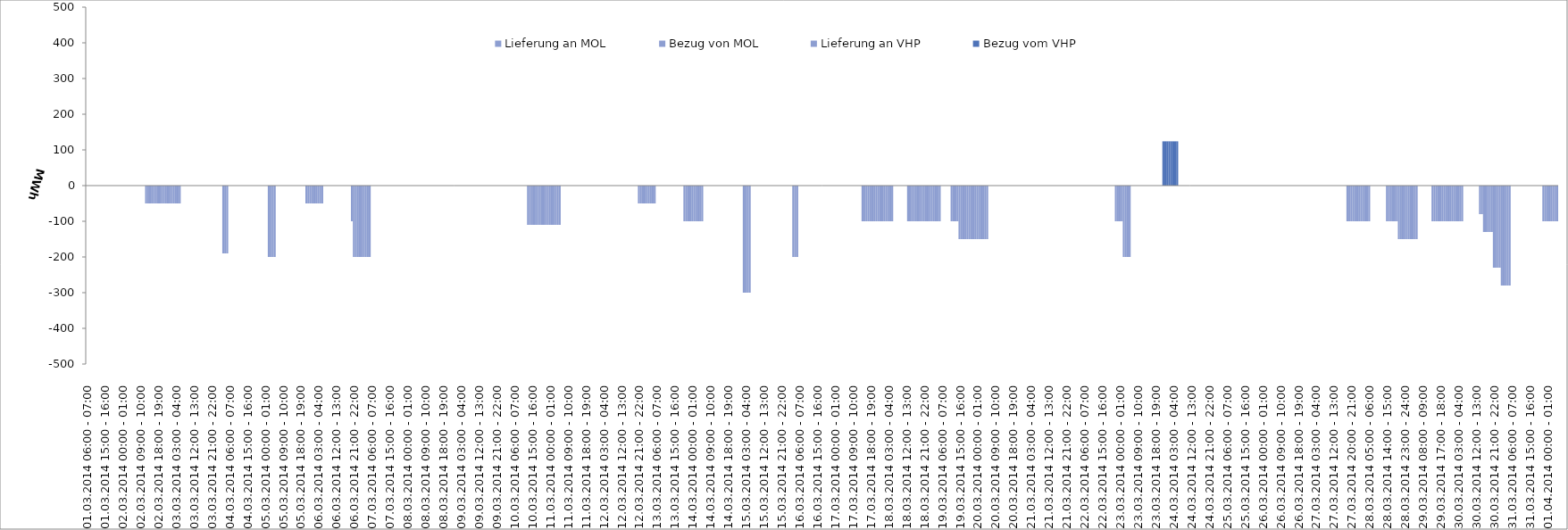
| Category | Bezug vom VHP | Lieferung an VHP | Bezug von MOL | Lieferung an MOL |
|---|---|---|---|---|
| 01.03.2014 06:00 - 07:00 | 0 | 0 | 0 | 0 |
| 01.03.2014 07:00 - 08:00 | 0 | 0 | 0 | 0 |
| 01.03.2014 08:00 - 09:00 | 0 | 0 | 0 | 0 |
| 01.03.2014 09:00 - 10:00 | 0 | 0 | 0 | 0 |
| 01.03.2014 10:00 - 11:00 | 0 | 0 | 0 | 0 |
| 01.03.2014 11:00 - 12:00 | 0 | 0 | 0 | 0 |
| 01.03.2014 12:00 - 13:00 | 0 | 0 | 0 | 0 |
| 01.03.2014 13:00 - 14:00 | 0 | 0 | 0 | 0 |
| 01.03.2014 14:00 - 15:00 | 0 | 0 | 0 | 0 |
| 01.03.2014 15:00 - 16:00 | 0 | 0 | 0 | 0 |
| 01.03.2014 16:00 - 17:00 | 0 | 0 | 0 | 0 |
| 01.03.2014 17:00 - 18:00 | 0 | 0 | 0 | 0 |
| 01.03.2014 18:00 - 19:00 | 0 | 0 | 0 | 0 |
| 01.03.2014 19:00 - 20:00 | 0 | 0 | 0 | 0 |
| 01.03.2014 20:00 - 21:00 | 0 | 0 | 0 | 0 |
| 01.03.2014 21:00 - 22:00 | 0 | 0 | 0 | 0 |
| 01.03.2014 22:00 - 23:00 | 0 | 0 | 0 | 0 |
| 01.03.2014 23:00 - 24:00 | 0 | 0 | 0 | 0 |
| 02.03.2014 00:00 - 01:00 | 0 | 0 | 0 | 0 |
| 02.03.2014 01:00 - 02:00 | 0 | 0 | 0 | 0 |
| 02.03.2014 02:00 - 03:00 | 0 | 0 | 0 | 0 |
| 02.03.2014 03:00 - 04:00 | 0 | 0 | 0 | 0 |
| 02.03.2014 04:00 - 05:00 | 0 | 0 | 0 | 0 |
| 02.03.2014 05:00 - 06:00 | 0 | 0 | 0 | 0 |
| 02.03.2014 06:00 - 07:00 | 0 | 0 | 0 | 0 |
| 02.03.2014 07:00 - 08:00 | 0 | 0 | 0 | 0 |
| 02.03.2014 08:00 - 09:00 | 0 | 0 | 0 | 0 |
| 02.03.2014 09:00 - 10:00 | 0 | 0 | 0 | 0 |
| 02.03.2014 10:00 - 11:00 | 0 | 0 | 0 | 0 |
| 02.03.2014 11:00 - 12:00 | 0 | 0 | 0 | 0 |
| 02.03.2014 12:00 - 13:00 | 0 | -50 | 0 | 0 |
| 02.03.2014 13:00 - 14:00 | 0 | -50 | 0 | 0 |
| 02.03.2014 14:00 - 15:00 | 0 | -50 | 0 | 0 |
| 02.03.2014 15:00 - 16:00 | 0 | -50 | 0 | 0 |
| 02.03.2014 16:00 - 17:00 | 0 | -50 | 0 | 0 |
| 02.03.2014 17:00 - 18:00 | 0 | -50 | 0 | 0 |
| 02.03.2014 18:00 - 19:00 | 0 | -50 | 0 | 0 |
| 02.03.2014 19:00 - 20:00 | 0 | -50 | 0 | 0 |
| 02.03.2014 20:00 - 21:00 | 0 | -50 | 0 | 0 |
| 02.03.2014 21:00 - 22:00 | 0 | -50 | 0 | 0 |
| 02.03.2014 22:00 - 23:00 | 0 | -50 | 0 | 0 |
| 02.03.2014 23:00 - 24:00 | 0 | -50 | 0 | 0 |
| 03.03.2014 00:00 - 01:00 | 0 | -50 | 0 | 0 |
| 03.03.2014 01:00 - 02:00 | 0 | -50 | 0 | 0 |
| 03.03.2014 02:00 - 03:00 | 0 | -50 | 0 | 0 |
| 03.03.2014 03:00 - 04:00 | 0 | -50 | 0 | 0 |
| 03.03.2014 04:00 - 05:00 | 0 | -50 | 0 | 0 |
| 03.03.2014 05:00 - 06:00 | 0 | -50 | 0 | 0 |
| 03.03.2014 06:00 - 07:00 | 0 | 0 | 0 | 0 |
| 03.03.2014 07:00 - 08:00 | 0 | 0 | 0 | 0 |
| 03.03.2014 08:00 - 09:00 | 0 | 0 | 0 | 0 |
| 03.03.2014 09:00 - 10:00 | 0 | 0 | 0 | 0 |
| 03.03.2014 10:00 - 11:00 | 0 | 0 | 0 | 0 |
| 03.03.2014 11:00 - 12:00 | 0 | 0 | 0 | 0 |
| 03.03.2014 12:00 - 13:00 | 0 | 0 | 0 | 0 |
| 03.03.2014 13:00 - 14:00 | 0 | 0 | 0 | 0 |
| 03.03.2014 14:00 - 15:00 | 0 | 0 | 0 | 0 |
| 03.03.2014 15:00 - 16:00 | 0 | 0 | 0 | 0 |
| 03.03.2014 16:00 - 17:00 | 0 | 0 | 0 | 0 |
| 03.03.2014 17:00 - 18:00 | 0 | 0 | 0 | 0 |
| 03.03.2014 18:00 - 19:00 | 0 | 0 | 0 | 0 |
| 03.03.2014 19:00 - 20:00 | 0 | 0 | 0 | 0 |
| 03.03.2014 20:00 - 21:00 | 0 | 0 | 0 | 0 |
| 03.03.2014 21:00 - 22:00 | 0 | 0 | 0 | 0 |
| 03.03.2014 22:00 - 23:00 | 0 | 0 | 0 | 0 |
| 03.03.2014 23:00 - 24:00 | 0 | 0 | 0 | 0 |
| 04.03.2014 00:00 - 01:00 | 0 | 0 | 0 | 0 |
| 04.03.2014 01:00 - 02:00 | 0 | 0 | 0 | 0 |
| 04.03.2014 02:00 - 03:00 | 0 | 0 | 0 | 0 |
| 04.03.2014 03:00 - 04:00 | 0 | -190 | 0 | 0 |
| 04.03.2014 04:00 - 05:00 | 0 | -190 | 0 | 0 |
| 04.03.2014 05:00 - 06:00 | 0 | -190 | 0 | 0 |
| 04.03.2014 06:00 - 07:00 | 0 | 0 | 0 | 0 |
| 04.03.2014 07:00 - 08:00 | 0 | 0 | 0 | 0 |
| 04.03.2014 08:00 - 09:00 | 0 | 0 | 0 | 0 |
| 04.03.2014 09:00 - 10:00 | 0 | 0 | 0 | 0 |
| 04.03.2014 10:00 - 11:00 | 0 | 0 | 0 | 0 |
| 04.03.2014 11:00 - 12:00 | 0 | 0 | 0 | 0 |
| 04.03.2014 12:00 - 13:00 | 0 | 0 | 0 | 0 |
| 04.03.2014 13:00 - 14:00 | 0 | 0 | 0 | 0 |
| 04.03.2014 14:00 - 15:00 | 0 | 0 | 0 | 0 |
| 04.03.2014 15:00 - 16:00 | 0 | 0 | 0 | 0 |
| 04.03.2014 16:00 - 17:00 | 0 | 0 | 0 | 0 |
| 04.03.2014 17:00 - 18:00 | 0 | 0 | 0 | 0 |
| 04.03.2014 18:00 - 19:00 | 0 | 0 | 0 | 0 |
| 04.03.2014 19:00 - 20:00 | 0 | 0 | 0 | 0 |
| 04.03.2014 20:00 - 21:00 | 0 | 0 | 0 | 0 |
| 04.03.2014 21:00 - 22:00 | 0 | 0 | 0 | 0 |
| 04.03.2014 22:00 - 23:00 | 0 | 0 | 0 | 0 |
| 04.03.2014 23:00 - 24:00 | 0 | 0 | 0 | 0 |
| 05.03.2014 00:00 - 01:00 | 0 | 0 | 0 | 0 |
| 05.03.2014 01:00 - 02:00 | 0 | 0 | 0 | 0 |
| 05.03.2014 02:00 - 03:00 | 0 | -200 | 0 | 0 |
| 05.03.2014 03:00 - 04:00 | 0 | -200 | 0 | 0 |
| 05.03.2014 04:00 - 05:00 | 0 | -200 | 0 | 0 |
| 05.03.2014 05:00 - 06:00 | 0 | -200 | 0 | 0 |
| 05.03.2014 06:00 - 07:00 | 0 | 0 | 0 | 0 |
| 05.03.2014 07:00 - 08:00 | 0 | 0 | 0 | 0 |
| 05.03.2014 08:00 - 09:00 | 0 | 0 | 0 | 0 |
| 05.03.2014 09:00 - 10:00 | 0 | 0 | 0 | 0 |
| 05.03.2014 10:00 - 11:00 | 0 | 0 | 0 | 0 |
| 05.03.2014 11:00 - 12:00 | 0 | 0 | 0 | 0 |
| 05.03.2014 12:00 - 13:00 | 0 | 0 | 0 | 0 |
| 05.03.2014 13:00 - 14:00 | 0 | 0 | 0 | 0 |
| 05.03.2014 14:00 - 15:00 | 0 | 0 | 0 | 0 |
| 05.03.2014 15:00 - 16:00 | 0 | 0 | 0 | 0 |
| 05.03.2014 16:00 - 17:00 | 0 | 0 | 0 | 0 |
| 05.03.2014 17:00 - 18:00 | 0 | 0 | 0 | 0 |
| 05.03.2014 18:00 - 19:00 | 0 | 0 | 0 | 0 |
| 05.03.2014 19:00 - 20:00 | 0 | 0 | 0 | 0 |
| 05.03.2014 20:00 - 21:00 | 0 | 0 | 0 | 0 |
| 05.03.2014 21:00 - 22:00 | 0 | -50 | 0 | 0 |
| 05.03.2014 22:00 - 23:00 | 0 | -50 | 0 | 0 |
| 05.03.2014 23:00 - 24:00 | 0 | -50 | 0 | 0 |
| 06.03.2014 00:00 - 01:00 | 0 | -50 | 0 | 0 |
| 06.03.2014 01:00 - 02:00 | 0 | -50 | 0 | 0 |
| 06.03.2014 02:00 - 03:00 | 0 | -50 | 0 | 0 |
| 06.03.2014 03:00 - 04:00 | 0 | -50 | 0 | 0 |
| 06.03.2014 04:00 - 05:00 | 0 | -50 | 0 | 0 |
| 06.03.2014 05:00 - 06:00 | 0 | -50 | 0 | 0 |
| 06.03.2014 06:00 - 07:00 | 0 | 0 | 0 | 0 |
| 06.03.2014 07:00 - 08:00 | 0 | 0 | 0 | 0 |
| 06.03.2014 08:00 - 09:00 | 0 | 0 | 0 | 0 |
| 06.03.2014 09:00 - 10:00 | 0 | 0 | 0 | 0 |
| 06.03.2014 10:00 - 11:00 | 0 | 0 | 0 | 0 |
| 06.03.2014 11:00 - 12:00 | 0 | 0 | 0 | 0 |
| 06.03.2014 12:00 - 13:00 | 0 | 0 | 0 | 0 |
| 06.03.2014 13:00 - 14:00 | 0 | 0 | 0 | 0 |
| 06.03.2014 14:00 - 15:00 | 0 | 0 | 0 | 0 |
| 06.03.2014 15:00 - 16:00 | 0 | 0 | 0 | 0 |
| 06.03.2014 16:00 - 17:00 | 0 | 0 | 0 | 0 |
| 06.03.2014 17:00 - 18:00 | 0 | 0 | 0 | 0 |
| 06.03.2014 18:00 - 19:00 | 0 | 0 | 0 | 0 |
| 06.03.2014 19:00 - 20:00 | 0 | 0 | 0 | 0 |
| 06.03.2014 20:00 - 21:00 | 0 | -100 | 0 | 0 |
| 06.03.2014 21:00 - 22:00 | 0 | -200 | 0 | 0 |
| 06.03.2014 22:00 - 23:00 | 0 | -200 | 0 | 0 |
| 06.03.2014 23:00 - 24:00 | 0 | -200 | 0 | 0 |
| 07.03.2014 00:00 - 01:00 | 0 | -200 | 0 | 0 |
| 07.03.2014 01:00 - 02:00 | 0 | -200 | 0 | 0 |
| 07.03.2014 02:00 - 03:00 | 0 | -200 | 0 | 0 |
| 07.03.2014 03:00 - 04:00 | 0 | -200 | 0 | 0 |
| 07.03.2014 04:00 - 05:00 | 0 | -200 | 0 | 0 |
| 07.03.2014 05:00 - 06:00 | 0 | -200 | 0 | 0 |
| 07.03.2014 06:00 - 07:00 | 0 | 0 | 0 | 0 |
| 07.03.2014 07:00 - 08:00 | 0 | 0 | 0 | 0 |
| 07.03.2014 08:00 - 09:00 | 0 | 0 | 0 | 0 |
| 07.03.2014 09:00 - 10:00 | 0 | 0 | 0 | 0 |
| 07.03.2014 10:00 - 11:00 | 0 | 0 | 0 | 0 |
| 07.03.2014 11:00 - 12:00 | 0 | 0 | 0 | 0 |
| 07.03.2014 12:00 - 13:00 | 0 | 0 | 0 | 0 |
| 07.03.2014 13:00 - 14:00 | 0 | 0 | 0 | 0 |
| 07.03.2014 14:00 - 15:00 | 0 | 0 | 0 | 0 |
| 07.03.2014 15:00 - 16:00 | 0 | 0 | 0 | 0 |
| 07.03.2014 16:00 - 17:00 | 0 | 0 | 0 | 0 |
| 07.03.2014 17:00 - 18:00 | 0 | 0 | 0 | 0 |
| 07.03.2014 18:00 - 19:00 | 0 | 0 | 0 | 0 |
| 07.03.2014 19:00 - 20:00 | 0 | 0 | 0 | 0 |
| 07.03.2014 20:00 - 21:00 | 0 | 0 | 0 | 0 |
| 07.03.2014 21:00 - 22:00 | 0 | 0 | 0 | 0 |
| 07.03.2014 22:00 - 23:00 | 0 | 0 | 0 | 0 |
| 07.03.2014 23:00 - 24:00 | 0 | 0 | 0 | 0 |
| 08.03.2014 00:00 - 01:00 | 0 | 0 | 0 | 0 |
| 08.03.2014 01:00 - 02:00 | 0 | 0 | 0 | 0 |
| 08.03.2014 02:00 - 03:00 | 0 | 0 | 0 | 0 |
| 08.03.2014 03:00 - 04:00 | 0 | 0 | 0 | 0 |
| 08.03.2014 04:00 - 05:00 | 0 | 0 | 0 | 0 |
| 08.03.2014 05:00 - 06:00 | 0 | 0 | 0 | 0 |
| 08.03.2014 06:00 - 07:00 | 0 | 0 | 0 | 0 |
| 08.03.2014 07:00 - 08:00 | 0 | 0 | 0 | 0 |
| 08.03.2014 08:00 - 09:00 | 0 | 0 | 0 | 0 |
| 08.03.2014 09:00 - 10:00 | 0 | 0 | 0 | 0 |
| 08.03.2014 10:00 - 11:00 | 0 | 0 | 0 | 0 |
| 08.03.2014 11:00 - 12:00 | 0 | 0 | 0 | 0 |
| 08.03.2014 12:00 - 13:00 | 0 | 0 | 0 | 0 |
| 08.03.2014 13:00 - 14:00 | 0 | 0 | 0 | 0 |
| 08.03.2014 14:00 - 15:00 | 0 | 0 | 0 | 0 |
| 08.03.2014 15:00 - 16:00 | 0 | 0 | 0 | 0 |
| 08.03.2014 16:00 - 17:00 | 0 | 0 | 0 | 0 |
| 08.03.2014 17:00 - 18:00 | 0 | 0 | 0 | 0 |
| 08.03.2014 18:00 - 19:00 | 0 | 0 | 0 | 0 |
| 08.03.2014 19:00 - 20:00 | 0 | 0 | 0 | 0 |
| 08.03.2014 20:00 - 21:00 | 0 | 0 | 0 | 0 |
| 08.03.2014 21:00 - 22:00 | 0 | 0 | 0 | 0 |
| 08.03.2014 22:00 - 23:00 | 0 | 0 | 0 | 0 |
| 08.03.2014 23:00 - 24:00 | 0 | 0 | 0 | 0 |
| 09.03.2014 00:00 - 01:00 | 0 | 0 | 0 | 0 |
| 09.03.2014 01:00 - 02:00 | 0 | 0 | 0 | 0 |
| 09.03.2014 02:00 - 03:00 | 0 | 0 | 0 | 0 |
| 09.03.2014 03:00 - 04:00 | 0 | 0 | 0 | 0 |
| 09.03.2014 04:00 - 05:00 | 0 | 0 | 0 | 0 |
| 09.03.2014 05:00 - 06:00 | 0 | 0 | 0 | 0 |
| 09.03.2014 06:00 - 07:00 | 0 | 0 | 0 | 0 |
| 09.03.2014 07:00 - 08:00 | 0 | 0 | 0 | 0 |
| 09.03.2014 08:00 - 09:00 | 0 | 0 | 0 | 0 |
| 09.03.2014 09:00 - 10:00 | 0 | 0 | 0 | 0 |
| 09.03.2014 10:00 - 11:00 | 0 | 0 | 0 | 0 |
| 09.03.2014 11:00 - 12:00 | 0 | 0 | 0 | 0 |
| 09.03.2014 12:00 - 13:00 | 0 | 0 | 0 | 0 |
| 09.03.2014 13:00 - 14:00 | 0 | 0 | 0 | 0 |
| 09.03.2014 14:00 - 15:00 | 0 | 0 | 0 | 0 |
| 09.03.2014 15:00 - 16:00 | 0 | 0 | 0 | 0 |
| 09.03.2014 16:00 - 17:00 | 0 | 0 | 0 | 0 |
| 09.03.2014 17:00 - 18:00 | 0 | 0 | 0 | 0 |
| 09.03.2014 18:00 - 19:00 | 0 | 0 | 0 | 0 |
| 09.03.2014 19:00 - 20:00 | 0 | 0 | 0 | 0 |
| 09.03.2014 20:00 - 21:00 | 0 | 0 | 0 | 0 |
| 09.03.2014 21:00 - 22:00 | 0 | 0 | 0 | 0 |
| 09.03.2014 22:00 - 23:00 | 0 | 0 | 0 | 0 |
| 09.03.2014 23:00 - 24:00 | 0 | 0 | 0 | 0 |
| 10.03.2014 00:00 - 01:00 | 0 | 0 | 0 | 0 |
| 10.03.2014 01:00 - 02:00 | 0 | 0 | 0 | 0 |
| 10.03.2014 02:00 - 03:00 | 0 | 0 | 0 | 0 |
| 10.03.2014 03:00 - 04:00 | 0 | 0 | 0 | 0 |
| 10.03.2014 04:00 - 05:00 | 0 | 0 | 0 | 0 |
| 10.03.2014 05:00 - 06:00 | 0 | 0 | 0 | 0 |
| 10.03.2014 06:00 - 07:00 | 0 | 0 | 0 | 0 |
| 10.03.2014 07:00 - 08:00 | 0 | 0 | 0 | 0 |
| 10.03.2014 08:00 - 09:00 | 0 | 0 | 0 | 0 |
| 10.03.2014 09:00 - 10:00 | 0 | 0 | 0 | 0 |
| 10.03.2014 10:00 - 11:00 | 0 | 0 | 0 | 0 |
| 10.03.2014 11:00 - 12:00 | 0 | 0 | 0 | 0 |
| 10.03.2014 12:00 - 13:00 | 0 | 0 | 0 | 0 |
| 10.03.2014 13:00 - 14:00 | 0 | -110 | 0 | 0 |
| 10.03.2014 14:00 - 15:00 | 0 | -110 | 0 | 0 |
| 10.03.2014 15:00 - 16:00 | 0 | -110 | 0 | 0 |
| 10.03.2014 16:00 - 17:00 | 0 | -110 | 0 | 0 |
| 10.03.2014 17:00 - 18:00 | 0 | -110 | 0 | 0 |
| 10.03.2014 18:00 - 19:00 | 0 | -110 | 0 | 0 |
| 10.03.2014 19:00 - 20:00 | 0 | -110 | 0 | 0 |
| 10.03.2014 20:00 - 21:00 | 0 | -110 | 0 | 0 |
| 10.03.2014 21:00 - 22:00 | 0 | -110 | 0 | 0 |
| 10.03.2014 22:00 - 23:00 | 0 | -110 | 0 | 0 |
| 10.03.2014 23:00 - 24:00 | 0 | -110 | 0 | 0 |
| 11.03.2014 00:00 - 01:00 | 0 | -110 | 0 | 0 |
| 11.03.2014 01:00 - 02:00 | 0 | -110 | 0 | 0 |
| 11.03.2014 02:00 - 03:00 | 0 | -110 | 0 | 0 |
| 11.03.2014 03:00 - 04:00 | 0 | -110 | 0 | 0 |
| 11.03.2014 04:00 - 05:00 | 0 | -110 | 0 | 0 |
| 11.03.2014 05:00 - 06:00 | 0 | -110 | 0 | 0 |
| 11.03.2014 06:00 - 07:00 | 0 | 0 | 0 | 0 |
| 11.03.2014 07:00 - 08:00 | 0 | 0 | 0 | 0 |
| 11.03.2014 08:00 - 09:00 | 0 | 0 | 0 | 0 |
| 11.03.2014 09:00 - 10:00 | 0 | 0 | 0 | 0 |
| 11.03.2014 10:00 - 11:00 | 0 | 0 | 0 | 0 |
| 11.03.2014 11:00 - 12:00 | 0 | 0 | 0 | 0 |
| 11.03.2014 12:00 - 13:00 | 0 | 0 | 0 | 0 |
| 11.03.2014 13:00 - 14:00 | 0 | 0 | 0 | 0 |
| 11.03.2014 14:00 - 15:00 | 0 | 0 | 0 | 0 |
| 11.03.2014 15:00 - 16:00 | 0 | 0 | 0 | 0 |
| 11.03.2014 16:00 - 17:00 | 0 | 0 | 0 | 0 |
| 11.03.2014 17:00 - 18:00 | 0 | 0 | 0 | 0 |
| 11.03.2014 18:00 - 19:00 | 0 | 0 | 0 | 0 |
| 11.03.2014 19:00 - 20:00 | 0 | 0 | 0 | 0 |
| 11.03.2014 20:00 - 21:00 | 0 | 0 | 0 | 0 |
| 11.03.2014 21:00 - 22:00 | 0 | 0 | 0 | 0 |
| 11.03.2014 22:00 - 23:00 | 0 | 0 | 0 | 0 |
| 11.03.2014 23:00 - 24:00 | 0 | 0 | 0 | 0 |
| 12.03.2014 00:00 - 01:00 | 0 | 0 | 0 | 0 |
| 12.03.2014 01:00 - 02:00 | 0 | 0 | 0 | 0 |
| 12.03.2014 02:00 - 03:00 | 0 | 0 | 0 | 0 |
| 12.03.2014 03:00 - 04:00 | 0 | 0 | 0 | 0 |
| 12.03.2014 04:00 - 05:00 | 0 | 0 | 0 | 0 |
| 12.03.2014 05:00 - 06:00 | 0 | 0 | 0 | 0 |
| 12.03.2014 06:00 - 07:00 | 0 | 0 | 0 | 0 |
| 12.03.2014 07:00 - 08:00 | 0 | 0 | 0 | 0 |
| 12.03.2014 08:00 - 09:00 | 0 | 0 | 0 | 0 |
| 12.03.2014 09:00 - 10:00 | 0 | 0 | 0 | 0 |
| 12.03.2014 10:00 - 11:00 | 0 | 0 | 0 | 0 |
| 12.03.2014 11:00 - 12:00 | 0 | 0 | 0 | 0 |
| 12.03.2014 12:00 - 13:00 | 0 | 0 | 0 | 0 |
| 12.03.2014 13:00 - 14:00 | 0 | 0 | 0 | 0 |
| 12.03.2014 14:00 - 15:00 | 0 | 0 | 0 | 0 |
| 12.03.2014 15:00 - 16:00 | 0 | 0 | 0 | 0 |
| 12.03.2014 16:00 - 17:00 | 0 | 0 | 0 | 0 |
| 12.03.2014 17:00 - 18:00 | 0 | 0 | 0 | 0 |
| 12.03.2014 18:00 - 19:00 | 0 | 0 | 0 | 0 |
| 12.03.2014 19:00 - 20:00 | 0 | 0 | 0 | 0 |
| 12.03.2014 20:00 - 21:00 | 0 | 0 | 0 | 0 |
| 12.03.2014 21:00 - 22:00 | 0 | -50 | 0 | 0 |
| 12.03.2014 22:00 - 23:00 | 0 | -50 | 0 | 0 |
| 12.03.2014 23:00 - 24:00 | 0 | -50 | 0 | 0 |
| 13.03.2014 00:00 - 01:00 | 0 | -50 | 0 | 0 |
| 13.03.2014 01:00 - 02:00 | 0 | -50 | 0 | 0 |
| 13.03.2014 02:00 - 03:00 | 0 | -50 | 0 | 0 |
| 13.03.2014 03:00 - 04:00 | 0 | -50 | 0 | 0 |
| 13.03.2014 04:00 - 05:00 | 0 | -50 | 0 | 0 |
| 13.03.2014 05:00 - 06:00 | 0 | -50 | 0 | 0 |
| 13.03.2014 06:00 - 07:00 | 0 | 0 | 0 | 0 |
| 13.03.2014 07:00 - 08:00 | 0 | 0 | 0 | 0 |
| 13.03.2014 08:00 - 09:00 | 0 | 0 | 0 | 0 |
| 13.03.2014 09:00 - 10:00 | 0 | 0 | 0 | 0 |
| 13.03.2014 10:00 - 11:00 | 0 | 0 | 0 | 0 |
| 13.03.2014 11:00 - 12:00 | 0 | 0 | 0 | 0 |
| 13.03.2014 12:00 - 13:00 | 0 | 0 | 0 | 0 |
| 13.03.2014 13:00 - 14:00 | 0 | 0 | 0 | 0 |
| 13.03.2014 14:00 - 15:00 | 0 | 0 | 0 | 0 |
| 13.03.2014 15:00 - 16:00 | 0 | 0 | 0 | 0 |
| 13.03.2014 16:00 - 17:00 | 0 | 0 | 0 | 0 |
| 13.03.2014 17:00 - 18:00 | 0 | 0 | 0 | 0 |
| 13.03.2014 18:00 - 19:00 | 0 | 0 | 0 | 0 |
| 13.03.2014 19:00 - 20:00 | 0 | 0 | 0 | 0 |
| 13.03.2014 20:00 - 21:00 | 0 | -100 | 0 | 0 |
| 13.03.2014 21:00 - 22:00 | 0 | -100 | 0 | 0 |
| 13.03.2014 22:00 - 23:00 | 0 | -100 | 0 | 0 |
| 13.03.2014 23:00 - 24:00 | 0 | -100 | 0 | 0 |
| 14.03.2014 00:00 - 01:00 | 0 | -100 | 0 | 0 |
| 14.03.2014 01:00 - 02:00 | 0 | -100 | 0 | 0 |
| 14.03.2014 02:00 - 03:00 | 0 | -100 | 0 | 0 |
| 14.03.2014 03:00 - 04:00 | 0 | -100 | 0 | 0 |
| 14.03.2014 04:00 - 05:00 | 0 | -100 | 0 | 0 |
| 14.03.2014 05:00 - 06:00 | 0 | -100 | 0 | 0 |
| 14.03.2014 06:00 - 07:00 | 0 | 0 | 0 | 0 |
| 14.03.2014 07:00 - 08:00 | 0 | 0 | 0 | 0 |
| 14.03.2014 08:00 - 09:00 | 0 | 0 | 0 | 0 |
| 14.03.2014 09:00 - 10:00 | 0 | 0 | 0 | 0 |
| 14.03.2014 10:00 - 11:00 | 0 | 0 | 0 | 0 |
| 14.03.2014 11:00 - 12:00 | 0 | 0 | 0 | 0 |
| 14.03.2014 12:00 - 13:00 | 0 | 0 | 0 | 0 |
| 14.03.2014 13:00 - 14:00 | 0 | 0 | 0 | 0 |
| 14.03.2014 14:00 - 15:00 | 0 | 0 | 0 | 0 |
| 14.03.2014 15:00 - 16:00 | 0 | 0 | 0 | 0 |
| 14.03.2014 16:00 - 17:00 | 0 | 0 | 0 | 0 |
| 14.03.2014 17:00 - 18:00 | 0 | 0 | 0 | 0 |
| 14.03.2014 18:00 - 19:00 | 0 | 0 | 0 | 0 |
| 14.03.2014 19:00 - 20:00 | 0 | 0 | 0 | 0 |
| 14.03.2014 20:00 - 21:00 | 0 | 0 | 0 | 0 |
| 14.03.2014 21:00 - 22:00 | 0 | 0 | 0 | 0 |
| 14.03.2014 22:00 - 23:00 | 0 | 0 | 0 | 0 |
| 14.03.2014 23:00 - 24:00 | 0 | 0 | 0 | 0 |
| 15.03.2014 00:00 - 01:00 | 0 | 0 | 0 | 0 |
| 15.03.2014 01:00 - 02:00 | 0 | 0 | 0 | 0 |
| 15.03.2014 02:00 - 03:00 | 0 | -300 | 0 | 0 |
| 15.03.2014 03:00 - 04:00 | 0 | -300 | 0 | 0 |
| 15.03.2014 04:00 - 05:00 | 0 | -300 | 0 | 0 |
| 15.03.2014 05:00 - 06:00 | 0 | -300 | 0 | 0 |
| 15.03.2014 06:00 - 07:00 | 0 | 0 | 0 | 0 |
| 15.03.2014 07:00 - 08:00 | 0 | 0 | 0 | 0 |
| 15.03.2014 08:00 - 09:00 | 0 | 0 | 0 | 0 |
| 15.03.2014 09:00 - 10:00 | 0 | 0 | 0 | 0 |
| 15.03.2014 10:00 - 11:00 | 0 | 0 | 0 | 0 |
| 15.03.2014 11:00 - 12:00 | 0 | 0 | 0 | 0 |
| 15.03.2014 12:00 - 13:00 | 0 | 0 | 0 | 0 |
| 15.03.2014 13:00 - 14:00 | 0 | 0 | 0 | 0 |
| 15.03.2014 14:00 - 15:00 | 0 | 0 | 0 | 0 |
| 15.03.2014 15:00 - 16:00 | 0 | 0 | 0 | 0 |
| 15.03.2014 16:00 - 17:00 | 0 | 0 | 0 | 0 |
| 15.03.2014 17:00 - 18:00 | 0 | 0 | 0 | 0 |
| 15.03.2014 18:00 - 19:00 | 0 | 0 | 0 | 0 |
| 15.03.2014 19:00 - 20:00 | 0 | 0 | 0 | 0 |
| 15.03.2014 20:00 - 21:00 | 0 | 0 | 0 | 0 |
| 15.03.2014 21:00 - 22:00 | 0 | 0 | 0 | 0 |
| 15.03.2014 22:00 - 23:00 | 0 | 0 | 0 | 0 |
| 15.03.2014 23:00 - 24:00 | 0 | 0 | 0 | 0 |
| 16.03.2014 00:00 - 01:00 | 0 | 0 | 0 | 0 |
| 16.03.2014 01:00 - 02:00 | 0 | 0 | 0 | 0 |
| 16.03.2014 02:00 - 03:00 | 0 | 0 | 0 | 0 |
| 16.03.2014 03:00 - 04:00 | 0 | -200 | 0 | 0 |
| 16.03.2014 04:00 - 05:00 | 0 | -200 | 0 | 0 |
| 16.03.2014 05:00 - 06:00 | 0 | -200 | 0 | 0 |
| 16.03.2014 06:00 - 07:00 | 0 | 0 | 0 | 0 |
| 16.03.2014 07:00 - 08:00 | 0 | 0 | 0 | 0 |
| 16.03.2014 08:00 - 09:00 | 0 | 0 | 0 | 0 |
| 16.03.2014 09:00 - 10:00 | 0 | 0 | 0 | 0 |
| 16.03.2014 10:00 - 11:00 | 0 | 0 | 0 | 0 |
| 16.03.2014 11:00 - 12:00 | 0 | 0 | 0 | 0 |
| 16.03.2014 12:00 - 13:00 | 0 | 0 | 0 | 0 |
| 16.03.2014 13:00 - 14:00 | 0 | 0 | 0 | 0 |
| 16.03.2014 14:00 - 15:00 | 0 | 0 | 0 | 0 |
| 16.03.2014 15:00 - 16:00 | 0 | 0 | 0 | 0 |
| 16.03.2014 16:00 - 17:00 | 0 | 0 | 0 | 0 |
| 16.03.2014 17:00 - 18:00 | 0 | 0 | 0 | 0 |
| 16.03.2014 18:00 - 19:00 | 0 | 0 | 0 | 0 |
| 16.03.2014 19:00 - 20:00 | 0 | 0 | 0 | 0 |
| 16.03.2014 20:00 - 21:00 | 0 | 0 | 0 | 0 |
| 16.03.2014 21:00 - 22:00 | 0 | 0 | 0 | 0 |
| 16.03.2014 22:00 - 23:00 | 0 | 0 | 0 | 0 |
| 16.03.2014 23:00 - 24:00 | 0 | 0 | 0 | 0 |
| 17.03.2014 00:00 - 01:00 | 0 | 0 | 0 | 0 |
| 17.03.2014 01:00 - 02:00 | 0 | 0 | 0 | 0 |
| 17.03.2014 02:00 - 03:00 | 0 | 0 | 0 | 0 |
| 17.03.2014 03:00 - 04:00 | 0 | 0 | 0 | 0 |
| 17.03.2014 04:00 - 05:00 | 0 | 0 | 0 | 0 |
| 17.03.2014 05:00 - 06:00 | 0 | 0 | 0 | 0 |
| 17.03.2014 06:00 - 07:00 | 0 | 0 | 0 | 0 |
| 17.03.2014 07:00 - 08:00 | 0 | 0 | 0 | 0 |
| 17.03.2014 08:00 - 09:00 | 0 | 0 | 0 | 0 |
| 17.03.2014 09:00 - 10:00 | 0 | 0 | 0 | 0 |
| 17.03.2014 10:00 - 11:00 | 0 | 0 | 0 | 0 |
| 17.03.2014 11:00 - 12:00 | 0 | 0 | 0 | 0 |
| 17.03.2014 12:00 - 13:00 | 0 | 0 | 0 | 0 |
| 17.03.2014 13:00 - 14:00 | 0 | 0 | 0 | 0 |
| 17.03.2014 14:00 - 15:00 | 0 | -100 | 0 | 0 |
| 17.03.2014 15:00 - 16:00 | 0 | -100 | 0 | 0 |
| 17.03.2014 16:00 - 17:00 | 0 | -100 | 0 | 0 |
| 17.03.2014 17:00 - 18:00 | 0 | -100 | 0 | 0 |
| 17.03.2014 18:00 - 19:00 | 0 | -100 | 0 | 0 |
| 17.03.2014 19:00 - 20:00 | 0 | -100 | 0 | 0 |
| 17.03.2014 20:00 - 21:00 | 0 | -100 | 0 | 0 |
| 17.03.2014 21:00 - 22:00 | 0 | -100 | 0 | 0 |
| 17.03.2014 22:00 - 23:00 | 0 | -100 | 0 | 0 |
| 17.03.2014 23:00 - 24:00 | 0 | -100 | 0 | 0 |
| 18.03.2014 00:00 - 01:00 | 0 | -100 | 0 | 0 |
| 18.03.2014 01:00 - 02:00 | 0 | -100 | 0 | 0 |
| 18.03.2014 02:00 - 03:00 | 0 | -100 | 0 | 0 |
| 18.03.2014 03:00 - 04:00 | 0 | -100 | 0 | 0 |
| 18.03.2014 04:00 - 05:00 | 0 | -100 | 0 | 0 |
| 18.03.2014 05:00 - 06:00 | 0 | -100 | 0 | 0 |
| 18.03.2014 06:00 - 07:00 | 0 | 0 | 0 | 0 |
| 18.03.2014 07:00 - 08:00 | 0 | 0 | 0 | 0 |
| 18.03.2014 08:00 - 09:00 | 0 | 0 | 0 | 0 |
| 18.03.2014 09:00 - 10:00 | 0 | 0 | 0 | 0 |
| 18.03.2014 10:00 - 11:00 | 0 | 0 | 0 | 0 |
| 18.03.2014 11:00 - 12:00 | 0 | 0 | 0 | 0 |
| 18.03.2014 12:00 - 13:00 | 0 | 0 | 0 | 0 |
| 18.03.2014 13:00 - 14:00 | 0 | -100 | 0 | 0 |
| 18.03.2014 14:00 - 15:00 | 0 | -100 | 0 | 0 |
| 18.03.2014 15:00 - 16:00 | 0 | -100 | 0 | 0 |
| 18.03.2014 16:00 - 17:00 | 0 | -100 | 0 | 0 |
| 18.03.2014 17:00 - 18:00 | 0 | -100 | 0 | 0 |
| 18.03.2014 18:00 - 19:00 | 0 | -100 | 0 | 0 |
| 18.03.2014 19:00 - 20:00 | 0 | -100 | 0 | 0 |
| 18.03.2014 20:00 - 21:00 | 0 | -100 | 0 | 0 |
| 18.03.2014 21:00 - 22:00 | 0 | -100 | 0 | 0 |
| 18.03.2014 22:00 - 23:00 | 0 | -100 | 0 | 0 |
| 18.03.2014 23:00 - 24:00 | 0 | -100 | 0 | 0 |
| 19.03.2014 00:00 - 01:00 | 0 | -100 | 0 | 0 |
| 19.03.2014 01:00 - 02:00 | 0 | -100 | 0 | 0 |
| 19.03.2014 02:00 - 03:00 | 0 | -100 | 0 | 0 |
| 19.03.2014 03:00 - 04:00 | 0 | -100 | 0 | 0 |
| 19.03.2014 04:00 - 05:00 | 0 | -100 | 0 | 0 |
| 19.03.2014 05:00 - 06:00 | 0 | -100 | 0 | 0 |
| 19.03.2014 06:00 - 07:00 | 0 | 0 | 0 | 0 |
| 19.03.2014 07:00 - 08:00 | 0 | 0 | 0 | 0 |
| 19.03.2014 08:00 - 09:00 | 0 | 0 | 0 | 0 |
| 19.03.2014 09:00 - 10:00 | 0 | 0 | 0 | 0 |
| 19.03.2014 10:00 - 11:00 | 0 | 0 | 0 | 0 |
| 19.03.2014 11:00 - 12:00 | 0 | -100 | 0 | 0 |
| 19.03.2014 12:00 - 13:00 | 0 | -100 | 0 | 0 |
| 19.03.2014 13:00 - 14:00 | 0 | -100 | 0 | 0 |
| 19.03.2014 14:00 - 15:00 | 0 | -100 | 0 | 0 |
| 19.03.2014 15:00 - 16:00 | 0 | -150 | 0 | 0 |
| 19.03.2014 16:00 - 17:00 | 0 | -150 | 0 | 0 |
| 19.03.2014 17:00 - 18:00 | 0 | -150 | 0 | 0 |
| 19.03.2014 18:00 - 19:00 | 0 | -150 | 0 | 0 |
| 19.03.2014 19:00 - 20:00 | 0 | -150 | 0 | 0 |
| 19.03.2014 20:00 - 21:00 | 0 | -150 | 0 | 0 |
| 19.03.2014 21:00 - 22:00 | 0 | -150 | 0 | 0 |
| 19.03.2014 22:00 - 23:00 | 0 | -150 | 0 | 0 |
| 19.03.2014 23:00 - 24:00 | 0 | -150 | 0 | 0 |
| 20.03.2014 00:00 - 01:00 | 0 | -150 | 0 | 0 |
| 20.03.2014 01:00 - 02:00 | 0 | -150 | 0 | 0 |
| 20.03.2014 02:00 - 03:00 | 0 | -150 | 0 | 0 |
| 20.03.2014 03:00 - 04:00 | 0 | -150 | 0 | 0 |
| 20.03.2014 04:00 - 05:00 | 0 | -150 | 0 | 0 |
| 20.03.2014 05:00 - 06:00 | 0 | -150 | 0 | 0 |
| 20.03.2014 06:00 - 07:00 | 0 | 0 | 0 | 0 |
| 20.03.2014 07:00 - 08:00 | 0 | 0 | 0 | 0 |
| 20.03.2014 08:00 - 09:00 | 0 | 0 | 0 | 0 |
| 20.03.2014 09:00 - 10:00 | 0 | 0 | 0 | 0 |
| 20.03.2014 10:00 - 11:00 | 0 | 0 | 0 | 0 |
| 20.03.2014 11:00 - 12:00 | 0 | 0 | 0 | 0 |
| 20.03.2014 12:00 - 13:00 | 0 | 0 | 0 | 0 |
| 20.03.2014 13:00 - 14:00 | 0 | 0 | 0 | 0 |
| 20.03.2014 14:00 - 15:00 | 0 | 0 | 0 | 0 |
| 20.03.2014 15:00 - 16:00 | 0 | 0 | 0 | 0 |
| 20.03.2014 16:00 - 17:00 | 0 | 0 | 0 | 0 |
| 20.03.2014 17:00 - 18:00 | 0 | 0 | 0 | 0 |
| 20.03.2014 18:00 - 19:00 | 0 | 0 | 0 | 0 |
| 20.03.2014 19:00 - 20:00 | 0 | 0 | 0 | 0 |
| 20.03.2014 20:00 - 21:00 | 0 | 0 | 0 | 0 |
| 20.03.2014 21:00 - 22:00 | 0 | 0 | 0 | 0 |
| 20.03.2014 22:00 - 23:00 | 0 | 0 | 0 | 0 |
| 20.03.2014 23:00 - 24:00 | 0 | 0 | 0 | 0 |
| 21.03.2014 00:00 - 01:00 | 0 | 0 | 0 | 0 |
| 21.03.2014 01:00 - 02:00 | 0 | 0 | 0 | 0 |
| 21.03.2014 02:00 - 03:00 | 0 | 0 | 0 | 0 |
| 21.03.2014 03:00 - 04:00 | 0 | 0 | 0 | 0 |
| 21.03.2014 04:00 - 05:00 | 0 | 0 | 0 | 0 |
| 21.03.2014 05:00 - 06:00 | 0 | 0 | 0 | 0 |
| 21.03.2014 06:00 - 07:00 | 0 | 0 | 0 | 0 |
| 21.03.2014 07:00 - 08:00 | 0 | 0 | 0 | 0 |
| 21.03.2014 08:00 - 09:00 | 0 | 0 | 0 | 0 |
| 21.03.2014 09:00 - 10:00 | 0 | 0 | 0 | 0 |
| 21.03.2014 10:00 - 11:00 | 0 | 0 | 0 | 0 |
| 21.03.2014 11:00 - 12:00 | 0 | 0 | 0 | 0 |
| 21.03.2014 12:00 - 13:00 | 0 | 0 | 0 | 0 |
| 21.03.2014 13:00 - 14:00 | 0 | 0 | 0 | 0 |
| 21.03.2014 14:00 - 15:00 | 0 | 0 | 0 | 0 |
| 21.03.2014 15:00 - 16:00 | 0 | 0 | 0 | 0 |
| 21.03.2014 16:00 - 17:00 | 0 | 0 | 0 | 0 |
| 21.03.2014 17:00 - 18:00 | 0 | 0 | 0 | 0 |
| 21.03.2014 18:00 - 19:00 | 0 | 0 | 0 | 0 |
| 21.03.2014 19:00 - 20:00 | 0 | 0 | 0 | 0 |
| 21.03.2014 20:00 - 21:00 | 0 | 0 | 0 | 0 |
| 21.03.2014 21:00 - 22:00 | 0 | 0 | 0 | 0 |
| 21.03.2014 22:00 - 23:00 | 0 | 0 | 0 | 0 |
| 21.03.2014 23:00 - 24:00 | 0 | 0 | 0 | 0 |
| 22.03.2014 00:00 - 01:00 | 0 | 0 | 0 | 0 |
| 22.03.2014 01:00 - 02:00 | 0 | 0 | 0 | 0 |
| 22.03.2014 02:00 - 03:00 | 0 | 0 | 0 | 0 |
| 22.03.2014 03:00 - 04:00 | 0 | 0 | 0 | 0 |
| 22.03.2014 04:00 - 05:00 | 0 | 0 | 0 | 0 |
| 22.03.2014 05:00 - 06:00 | 0 | 0 | 0 | 0 |
| 22.03.2014 06:00 - 07:00 | 0 | 0 | 0 | 0 |
| 22.03.2014 07:00 - 08:00 | 0 | 0 | 0 | 0 |
| 22.03.2014 08:00 - 09:00 | 0 | 0 | 0 | 0 |
| 22.03.2014 09:00 - 10:00 | 0 | 0 | 0 | 0 |
| 22.03.2014 10:00 - 11:00 | 0 | 0 | 0 | 0 |
| 22.03.2014 11:00 - 12:00 | 0 | 0 | 0 | 0 |
| 22.03.2014 12:00 - 13:00 | 0 | 0 | 0 | 0 |
| 22.03.2014 13:00 - 14:00 | 0 | 0 | 0 | 0 |
| 22.03.2014 14:00 - 15:00 | 0 | 0 | 0 | 0 |
| 22.03.2014 15:00 - 16:00 | 0 | 0 | 0 | 0 |
| 22.03.2014 16:00 - 17:00 | 0 | 0 | 0 | 0 |
| 22.03.2014 17:00 - 18:00 | 0 | 0 | 0 | 0 |
| 22.03.2014 18:00 - 19:00 | 0 | 0 | 0 | 0 |
| 22.03.2014 19:00 - 20:00 | 0 | 0 | 0 | 0 |
| 22.03.2014 20:00 - 21:00 | 0 | 0 | 0 | 0 |
| 22.03.2014 21:00 - 22:00 | 0 | 0 | 0 | 0 |
| 22.03.2014 22:00 - 23:00 | 0 | -100 | 0 | 0 |
| 22.03.2014 23:00 - 24:00 | 0 | -100 | 0 | 0 |
| 23.03.2014 00:00 - 01:00 | 0 | -100 | 0 | 0 |
| 23.03.2014 01:00 - 02:00 | 0 | -100 | 0 | 0 |
| 23.03.2014 02:00 - 03:00 | 0 | -200 | 0 | 0 |
| 23.03.2014 03:00 - 04:00 | 0 | -200 | 0 | 0 |
| 23.03.2014 04:00 - 05:00 | 0 | -200 | 0 | 0 |
| 23.03.2014 05:00 - 06:00 | 0 | -200 | 0 | 0 |
| 23.03.2014 06:00 - 07:00 | 0 | 0 | 0 | 0 |
| 23.03.2014 07:00 - 08:00 | 0 | 0 | 0 | 0 |
| 23.03.2014 08:00 - 09:00 | 0 | 0 | 0 | 0 |
| 23.03.2014 09:00 - 10:00 | 0 | 0 | 0 | 0 |
| 23.03.2014 10:00 - 11:00 | 0 | 0 | 0 | 0 |
| 23.03.2014 11:00 - 12:00 | 0 | 0 | 0 | 0 |
| 23.03.2014 12:00 - 13:00 | 0 | 0 | 0 | 0 |
| 23.03.2014 13:00 - 14:00 | 0 | 0 | 0 | 0 |
| 23.03.2014 14:00 - 15:00 | 0 | 0 | 0 | 0 |
| 23.03.2014 15:00 - 16:00 | 0 | 0 | 0 | 0 |
| 23.03.2014 16:00 - 17:00 | 0 | 0 | 0 | 0 |
| 23.03.2014 17:00 - 18:00 | 0 | 0 | 0 | 0 |
| 23.03.2014 18:00 - 19:00 | 0 | 0 | 0 | 0 |
| 23.03.2014 19:00 - 20:00 | 0 | 0 | 0 | 0 |
| 23.03.2014 20:00 - 21:00 | 0 | 0 | 0 | 0 |
| 23.03.2014 21:00 - 22:00 | 0 | 0 | 0 | 0 |
| 23.03.2014 22:00 - 23:00 | 124 | 0 | 0 | 0 |
| 23.03.2014 23:00 - 24:00 | 124 | 0 | 0 | 0 |
| 24.03.2014 00:00 - 01:00 | 124 | 0 | 0 | 0 |
| 24.03.2014 01:00 - 02:00 | 124 | 0 | 0 | 0 |
| 24.03.2014 02:00 - 03:00 | 124 | 0 | 0 | 0 |
| 24.03.2014 03:00 - 04:00 | 124 | 0 | 0 | 0 |
| 24.03.2014 04:00 - 05:00 | 124 | 0 | 0 | 0 |
| 24.03.2014 05:00 - 06:00 | 124 | 0 | 0 | 0 |
| 24.03.2014 06:00 - 07:00 | 0 | 0 | 0 | 0 |
| 24.03.2014 07:00 - 08:00 | 0 | 0 | 0 | 0 |
| 24.03.2014 08:00 - 09:00 | 0 | 0 | 0 | 0 |
| 24.03.2014 09:00 - 10:00 | 0 | 0 | 0 | 0 |
| 24.03.2014 10:00 - 11:00 | 0 | 0 | 0 | 0 |
| 24.03.2014 11:00 - 12:00 | 0 | 0 | 0 | 0 |
| 24.03.2014 12:00 - 13:00 | 0 | 0 | 0 | 0 |
| 24.03.2014 13:00 - 14:00 | 0 | 0 | 0 | 0 |
| 24.03.2014 14:00 - 15:00 | 0 | 0 | 0 | 0 |
| 24.03.2014 15:00 - 16:00 | 0 | 0 | 0 | 0 |
| 24.03.2014 16:00 - 17:00 | 0 | 0 | 0 | 0 |
| 24.03.2014 17:00 - 18:00 | 0 | 0 | 0 | 0 |
| 24.03.2014 18:00 - 19:00 | 0 | 0 | 0 | 0 |
| 24.03.2014 19:00 - 20:00 | 0 | 0 | 0 | 0 |
| 24.03.2014 20:00 - 21:00 | 0 | 0 | 0 | 0 |
| 24.03.2014 21:00 - 22:00 | 0 | 0 | 0 | 0 |
| 24.03.2014 22:00 - 23:00 | 0 | 0 | 0 | 0 |
| 24.03.2014 23:00 - 24:00 | 0 | 0 | 0 | 0 |
| 25.03.2014 00:00 - 01:00 | 0 | 0 | 0 | 0 |
| 25.03.2014 01:00 - 02:00 | 0 | 0 | 0 | 0 |
| 25.03.2014 02:00 - 03:00 | 0 | 0 | 0 | 0 |
| 25.03.2014 03:00 - 04:00 | 0 | 0 | 0 | 0 |
| 25.03.2014 04:00 - 05:00 | 0 | 0 | 0 | 0 |
| 25.03.2014 05:00 - 06:00 | 0 | 0 | 0 | 0 |
| 25.03.2014 06:00 - 07:00 | 0 | 0 | 0 | 0 |
| 25.03.2014 07:00 - 08:00 | 0 | 0 | 0 | 0 |
| 25.03.2014 08:00 - 09:00 | 0 | 0 | 0 | 0 |
| 25.03.2014 09:00 - 10:00 | 0 | 0 | 0 | 0 |
| 25.03.2014 10:00 - 11:00 | 0 | 0 | 0 | 0 |
| 25.03.2014 11:00 - 12:00 | 0 | 0 | 0 | 0 |
| 25.03.2014 12:00 - 13:00 | 0 | 0 | 0 | 0 |
| 25.03.2014 13:00 - 14:00 | 0 | 0 | 0 | 0 |
| 25.03.2014 14:00 - 15:00 | 0 | 0 | 0 | 0 |
| 25.03.2014 15:00 - 16:00 | 0 | 0 | 0 | 0 |
| 25.03.2014 16:00 - 17:00 | 0 | 0 | 0 | 0 |
| 25.03.2014 17:00 - 18:00 | 0 | 0 | 0 | 0 |
| 25.03.2014 18:00 - 19:00 | 0 | 0 | 0 | 0 |
| 25.03.2014 19:00 - 20:00 | 0 | 0 | 0 | 0 |
| 25.03.2014 20:00 - 21:00 | 0 | 0 | 0 | 0 |
| 25.03.2014 21:00 - 22:00 | 0 | 0 | 0 | 0 |
| 25.03.2014 22:00 - 23:00 | 0 | 0 | 0 | 0 |
| 25.03.2014 23:00 - 24:00 | 0 | 0 | 0 | 0 |
| 26.03.2014 00:00 - 01:00 | 0 | 0 | 0 | 0 |
| 26.03.2014 01:00 - 02:00 | 0 | 0 | 0 | 0 |
| 26.03.2014 02:00 - 03:00 | 0 | 0 | 0 | 0 |
| 26.03.2014 03:00 - 04:00 | 0 | 0 | 0 | 0 |
| 26.03.2014 04:00 - 05:00 | 0 | 0 | 0 | 0 |
| 26.03.2014 05:00 - 06:00 | 0 | 0 | 0 | 0 |
| 26.03.2014 06:00 - 07:00 | 0 | 0 | 0 | 0 |
| 26.03.2014 07:00 - 08:00 | 0 | 0 | 0 | 0 |
| 26.03.2014 08:00 - 09:00 | 0 | 0 | 0 | 0 |
| 26.03.2014 09:00 - 10:00 | 0 | 0 | 0 | 0 |
| 26.03.2014 10:00 - 11:00 | 0 | 0 | 0 | 0 |
| 26.03.2014 11:00 - 12:00 | 0 | 0 | 0 | 0 |
| 26.03.2014 12:00 - 13:00 | 0 | 0 | 0 | 0 |
| 26.03.2014 13:00 - 14:00 | 0 | 0 | 0 | 0 |
| 26.03.2014 14:00 - 15:00 | 0 | 0 | 0 | 0 |
| 26.03.2014 15:00 - 16:00 | 0 | 0 | 0 | 0 |
| 26.03.2014 16:00 - 17:00 | 0 | 0 | 0 | 0 |
| 26.03.2014 17:00 - 18:00 | 0 | 0 | 0 | 0 |
| 26.03.2014 18:00 - 19:00 | 0 | 0 | 0 | 0 |
| 26.03.2014 19:00 - 20:00 | 0 | 0 | 0 | 0 |
| 26.03.2014 20:00 - 21:00 | 0 | 0 | 0 | 0 |
| 26.03.2014 21:00 - 22:00 | 0 | 0 | 0 | 0 |
| 26.03.2014 22:00 - 23:00 | 0 | 0 | 0 | 0 |
| 26.03.2014 23:00 - 24:00 | 0 | 0 | 0 | 0 |
| 27.03.2014 00:00 - 01:00 | 0 | 0 | 0 | 0 |
| 27.03.2014 01:00 - 02:00 | 0 | 0 | 0 | 0 |
| 27.03.2014 02:00 - 03:00 | 0 | 0 | 0 | 0 |
| 27.03.2014 03:00 - 04:00 | 0 | 0 | 0 | 0 |
| 27.03.2014 04:00 - 05:00 | 0 | 0 | 0 | 0 |
| 27.03.2014 05:00 - 06:00 | 0 | 0 | 0 | 0 |
| 27.03.2014 06:00 - 07:00 | 0 | 0 | 0 | 0 |
| 27.03.2014 07:00 - 08:00 | 0 | 0 | 0 | 0 |
| 27.03.2014 08:00 - 09:00 | 0 | 0 | 0 | 0 |
| 27.03.2014 09:00 - 10:00 | 0 | 0 | 0 | 0 |
| 27.03.2014 10:00 - 11:00 | 0 | 0 | 0 | 0 |
| 27.03.2014 11:00 - 12:00 | 0 | 0 | 0 | 0 |
| 27.03.2014 12:00 - 13:00 | 0 | 0 | 0 | 0 |
| 27.03.2014 12:00 - 13:00 | 0 | 0 | 0 | 0 |
| 27.03.2014 13:00 - 14:00 | 0 | 0 | 0 | 0 |
| 27.03.2014 14:00 - 15:00 | 0 | 0 | 0 | 0 |
| 27.03.2014 15:00 - 16:00 | 0 | 0 | 0 | 0 |
| 27.03.2014 16:00 - 17:00 | 0 | 0 | 0 | 0 |
| 27.03.2014 17:00 - 18:00 | 0 | 0 | 0 | 0 |
| 27.03.2014 18:00 - 19:00 | 0 | -100 | 0 | 0 |
| 27.03.2014 19:00 - 20:00 | 0 | -100 | 0 | 0 |
| 27.03.2014 20:00 - 21:00 | 0 | -100 | 0 | 0 |
| 27.03.2014 21:00 - 22:00 | 0 | -100 | 0 | 0 |
| 27.03.2014 22:00 - 23:00 | 0 | -100 | 0 | 0 |
| 27.03.2014 23:00 - 24:00 | 0 | -100 | 0 | 0 |
| 28.03.2014 00:00 - 01:00 | 0 | -100 | 0 | 0 |
| 28.03.2014 01:00 - 02:00 | 0 | -100 | 0 | 0 |
| 28.03.2014 02:00 - 03:00 | 0 | -100 | 0 | 0 |
| 28.03.2014 03:00 - 04:00 | 0 | -100 | 0 | 0 |
| 28.03.2014 04:00 - 05:00 | 0 | -100 | 0 | 0 |
| 28.03.2014 05:00 - 06:00 | 0 | -100 | 0 | 0 |
| 28.03.2014 06:00 - 07:00 | 0 | 0 | 0 | 0 |
| 28.03.2014 07:00 - 08:00 | 0 | 0 | 0 | 0 |
| 28.03.2014 08:00 - 09:00 | 0 | 0 | 0 | 0 |
| 28.03.2014 09:00 - 10:00 | 0 | 0 | 0 | 0 |
| 28.03.2014 10:00 - 11:00 | 0 | 0 | 0 | 0 |
| 28.03.2014 11:00 - 12:00 | 0 | 0 | 0 | 0 |
| 28.03.2014 12:00 - 13:00 | 0 | 0 | 0 | 0 |
| 28.03.2014 13:00 - 14:00 | 0 | 0 | 0 | 0 |
| 28.03.2014 14:00 - 15:00 | 0 | -100 | 0 | 0 |
| 28.03.2014 15:00 - 16:00 | 0 | -100 | 0 | 0 |
| 28.03.2014 16:00 - 17:00 | 0 | -100 | 0 | 0 |
| 28.03.2014 17:00 - 18:00 | 0 | -100 | 0 | 0 |
| 28.03.2014 18:00 - 19:00 | 0 | -100 | 0 | 0 |
| 28.03.2014 19:00 - 20:00 | 0 | -100 | 0 | 0 |
| 28.03.2014 20:00 - 21:00 | 0 | -150 | 0 | 0 |
| 28.03.2014 21:00 - 22:00 | 0 | -150 | 0 | 0 |
| 28.03.2014 22:00 - 23:00 | 0 | -150 | 0 | 0 |
| 28.03.2014 23:00 - 24:00 | 0 | -150 | 0 | 0 |
| 29.03.2014 00:00 - 01:00 | 0 | -150 | 0 | 0 |
| 29.03.2014 01:00 - 02:00 | 0 | -150 | 0 | 0 |
| 29.03.2014 02:00 - 03:00 | 0 | -150 | 0 | 0 |
| 29.03.2014 03:00 - 04:00 | 0 | -150 | 0 | 0 |
| 29.03.2014 04:00 - 05:00 | 0 | -150 | 0 | 0 |
| 29.03.2014 05:00 - 06:00 | 0 | -150 | 0 | 0 |
| 29.03.2014 06:00 - 07:00 | 0 | 0 | 0 | 0 |
| 29.03.2014 07:00 - 08:00 | 0 | 0 | 0 | 0 |
| 29.03.2014 08:00 - 09:00 | 0 | 0 | 0 | 0 |
| 29.03.2014 09:00 - 10:00 | 0 | 0 | 0 | 0 |
| 29.03.2014 10:00 - 11:00 | 0 | 0 | 0 | 0 |
| 29.03.2014 11:00 - 12:00 | 0 | 0 | 0 | 0 |
| 29.03.2014 12:00 - 13:00 | 0 | 0 | 0 | 0 |
| 29.03.2014 13:00 - 14:00 | 0 | -100 | 0 | 0 |
| 29.03.2014 14:00 - 15:00 | 0 | -100 | 0 | 0 |
| 29.03.2014 15:00 - 16:00 | 0 | -100 | 0 | 0 |
| 29.03.2014 16:00 - 17:00 | 0 | -100 | 0 | 0 |
| 29.03.2014 17:00 - 18:00 | 0 | -100 | 0 | 0 |
| 29.03.2014 18:00 - 19:00 | 0 | -100 | 0 | 0 |
| 29.03.2014 19:00 - 20:00 | 0 | -100 | 0 | 0 |
| 29.03.2014 20:00 - 21:00 | 0 | -100 | 0 | 0 |
| 29.03.2014 21:00 - 22:00 | 0 | -100 | 0 | 0 |
| 29.03.2014 22:00 - 23:00 | 0 | -100 | 0 | 0 |
| 29.03.2014 23:00 - 24:00 | 0 | -100 | 0 | 0 |
| 30.03.2014 00:00 - 01:00 | 0 | -100 | 0 | 0 |
| 30.03.2014 02:00 - 03:00 | 0 | -100 | 0 | 0 |
| 30.03.2014 03:00 - 04:00 | 0 | -100 | 0 | 0 |
| 30.03.2014 04:00 - 05:00 | 0 | -100 | 0 | 0 |
| 30.03.2014 05:00 - 06:00 | 0 | -100 | 0 | 0 |
| 30.03.2014 06:00 - 07:00 | 0 | 0 | 0 | 0 |
| 30.03.2014 07:00 - 08:00 | 0 | 0 | 0 | 0 |
| 30.03.2014 08:00 - 09:00 | 0 | 0 | 0 | 0 |
| 30.03.2014 09:00 - 10:00 | 0 | 0 | 0 | 0 |
| 30.03.2014 10:00 - 11:00 | 0 | 0 | 0 | 0 |
| 30.03.2014 11:00 - 12:00 | 0 | 0 | 0 | 0 |
| 30.03.2014 12:00 - 13:00 | 0 | 0 | 0 | 0 |
| 30.03.2014 13:00 - 14:00 | 0 | 0 | 0 | 0 |
| 30.03.2014 14:00 - 15:00 | 0 | -80 | 0 | 0 |
| 30.03.2014 15:00 - 16:00 | 0 | -80 | 0 | 0 |
| 30.03.2014 16:00 - 17:00 | 0 | -130 | 0 | 0 |
| 30.03.2014 17:00 - 18:00 | 0 | -130 | 0 | 0 |
| 30.03.2014 18:00 - 19:00 | 0 | -130 | 0 | 0 |
| 30.03.2014 19:00 - 20:00 | 0 | -130 | 0 | 0 |
| 30.03.2014 20:00 - 21:00 | 0 | -130 | 0 | 0 |
| 30.03.2014 21:00 - 22:00 | 0 | -230 | 0 | 0 |
| 30.03.2014 22:00 - 23:00 | 0 | -230 | 0 | 0 |
| 30.03.2014 23:00 - 24:00 | 0 | -230 | 0 | 0 |
| 31.03.2014 00:00 - 01:00 | 0 | -230 | 0 | 0 |
| 31.03.2014 01:00 - 02:00 | 0 | -280 | 0 | 0 |
| 31.03.2014 02:00 - 03:00 | 0 | -280 | 0 | 0 |
| 31.03.2014 03:00 - 04:00 | 0 | -280 | 0 | 0 |
| 31.03.2014 04:00 - 05:00 | 0 | -280 | 0 | 0 |
| 31.03.2014 05:00 - 06:00 | 0 | -280 | 0 | 0 |
| 31.03.2014 06:00 - 07:00 | 0 | 0 | 0 | 0 |
| 31.03.2014 07:00 - 08:00 | 0 | 0 | 0 | 0 |
| 31.03.2014 08:00 - 09:00 | 0 | 0 | 0 | 0 |
| 31.03.2014 09:00 - 10:00 | 0 | 0 | 0 | 0 |
| 31.03.2014 10:00 - 11:00 | 0 | 0 | 0 | 0 |
| 31.03.2014 11:00 - 12:00 | 0 | 0 | 0 | 0 |
| 31.03.2014 12:00 - 13:00 | 0 | 0 | 0 | 0 |
| 31.03.2014 13:00 - 14:00 | 0 | 0 | 0 | 0 |
| 31.03.2014 14:00 - 15:00 | 0 | 0 | 0 | 0 |
| 31.03.2014 15:00 - 16:00 | 0 | 0 | 0 | 0 |
| 31.03.2014 16:00 - 17:00 | 0 | 0 | 0 | 0 |
| 31.03.2014 17:00 - 18:00 | 0 | 0 | 0 | 0 |
| 31.03.2014 18:00 - 19:00 | 0 | 0 | 0 | 0 |
| 31.03.2014 19:00 - 20:00 | 0 | 0 | 0 | 0 |
| 31.03.2014 20:00 - 21:00 | 0 | 0 | 0 | 0 |
| 31.03.2014 21:00 - 22:00 | 0 | 0 | 0 | 0 |
| 31.03.2014 22:00 - 23:00 | 0 | -100 | 0 | 0 |
| 31.03.2014 23:00 - 24:00 | 0 | -100 | 0 | 0 |
| 01.04.2014 00:00 - 01:00 | 0 | -100 | 0 | 0 |
| 01.04.2014 01:00 - 02:00 | 0 | -100 | 0 | 0 |
| 01.04.2014 02:00 - 03:00 | 0 | -100 | 0 | 0 |
| 01.04.2014 03:00 - 04:00 | 0 | -100 | 0 | 0 |
| 01.04.2014 04:00 - 05:00 | 0 | -100 | 0 | 0 |
| 01.04.2014 05:00 - 06:00 | 0 | -100 | 0 | 0 |